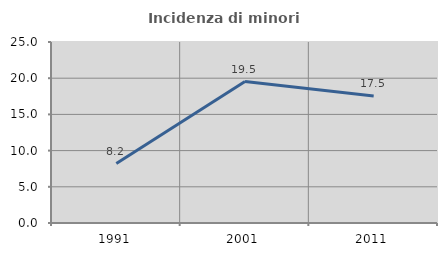
| Category | Incidenza di minori stranieri |
|---|---|
| 1991.0 | 8.203 |
| 2001.0 | 19.531 |
| 2011.0 | 17.529 |